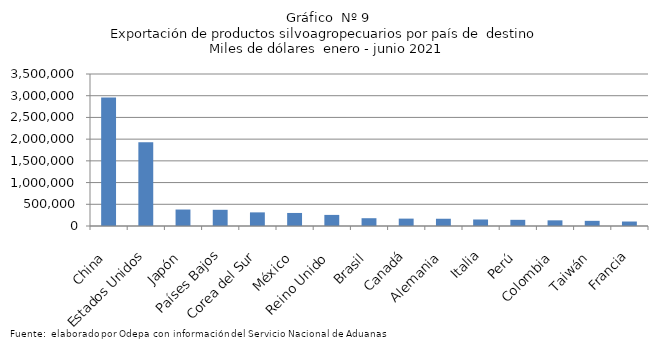
| Category | Series 0 |
|---|---|
| China | 2960422.321 |
| Estados Unidos | 1926802.551 |
| Japón | 379325.071 |
| Países Bajos | 373004.037 |
| Corea del Sur | 313808.113 |
| México | 300275.542 |
| Reino Unido | 255381.724 |
| Brasil | 179387.318 |
| Canadá | 169979.045 |
| Alemania | 166993.879 |
| Italia | 149855.493 |
| Perú | 142085.089 |
| Colombia | 130315.562 |
| Taiwán | 118952.298 |
| Francia | 103141.927 |